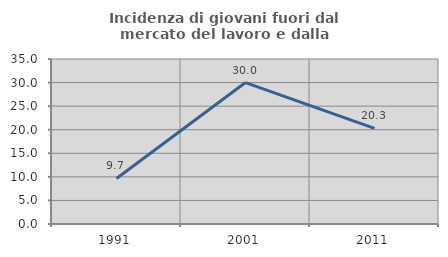
| Category | Incidenza di giovani fuori dal mercato del lavoro e dalla formazione  |
|---|---|
| 1991.0 | 9.659 |
| 2001.0 | 30 |
| 2011.0 | 20.27 |